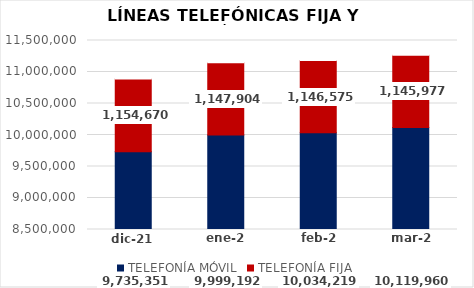
| Category | TELEFONÍA MÓVIL | TELEFONÍA FIJA | Series 2 |
|---|---|---|---|
| 0 | 9735351.005 | 1154670 | 2021-12-01 |
| 1 | 9999192.007 | 1147904 | 2022-01-01 |
| 2 | 10034219.006 | 1146575 | 2022-02-01 |
| 3 | 10119959.998 | 1145977 | 2022-03-01 |